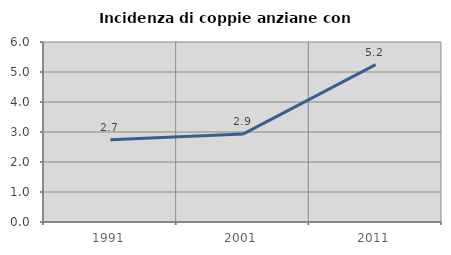
| Category | Incidenza di coppie anziane con figli |
|---|---|
| 1991.0 | 2.74 |
| 2001.0 | 2.93 |
| 2011.0 | 5.247 |